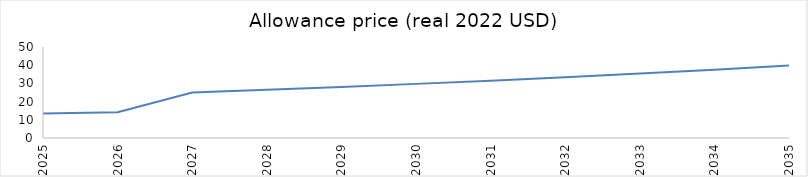
| Category | Series 0 |
|---|---|
| 2025.0 | 13.525 |
| 2026.0 | 14.201 |
| 2027.0 | 24.97 |
| 2028.0 | 26.468 |
| 2029.0 | 28.056 |
| 2030.0 | 29.739 |
| 2031.0 | 31.524 |
| 2032.0 | 33.415 |
| 2033.0 | 35.42 |
| 2034.0 | 37.545 |
| 2035.0 | 39.798 |